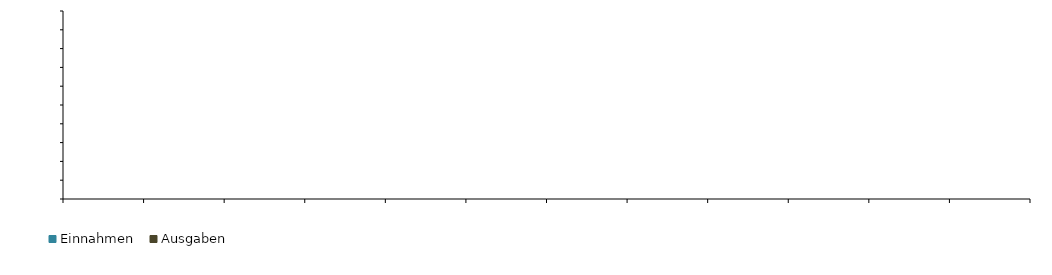
| Category | Einnahmen | Ausgaben |
|---|---|---|
| Jänner | 0 | 0 |
| Februar | 0 | 0 |
| März | 0 | 0 |
| April | 0 | 0 |
| Mai | 0 | 0 |
| Juni | 0 | 0 |
| Juli | 0 | 0 |
| August | 0 | 0 |
| September | 0 | 0 |
| Oktober | 0 | 0 |
| November | 0 | 0 |
| Dezember | 0 | 0 |